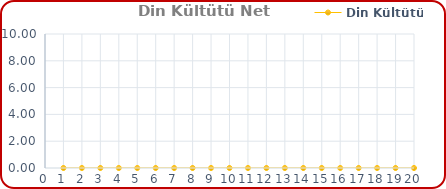
| Category | Din Kültütü |
|---|---|
| 0 | 0 |
| 1 | 0 |
| 2 | 0 |
| 3 | 0 |
| 4 | 0 |
| 5 | 0 |
| 6 | 0 |
| 7 | 0 |
| 8 | 0 |
| 9 | 0 |
| 10 | 0 |
| 11 | 0 |
| 12 | 0 |
| 13 | 0 |
| 14 | 0 |
| 15 | 0 |
| 16 | 0 |
| 17 | 0 |
| 18 | 0 |
| 19 | 0 |